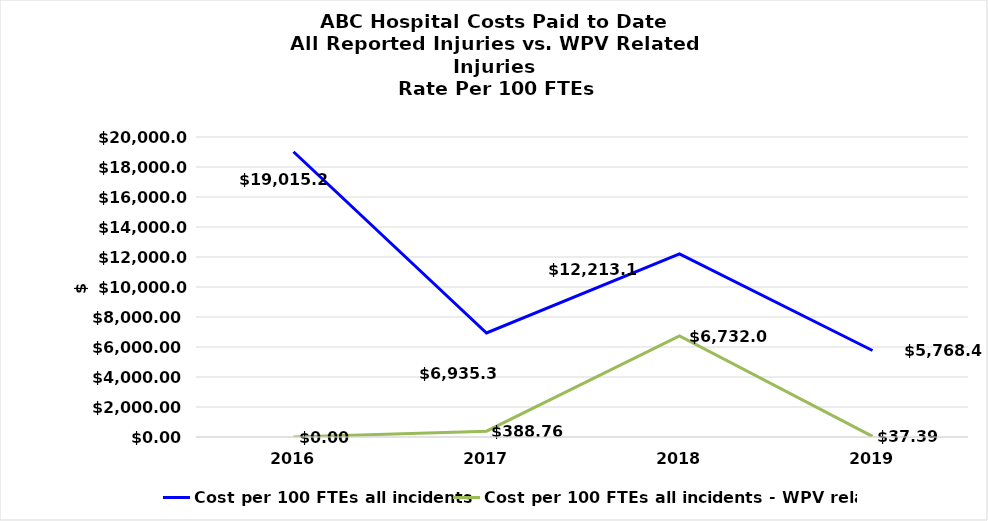
| Category | Cost per 100 FTEs all incidents | Cost per 100 FTEs all incidents - WPV related |
|---|---|---|
| 2016.0 | 19015.272 | 0 |
| 2017.0 | 6935.382 | 388.755 |
| 2018.0 | 12213.138 | 6731.996 |
| 2019.0 | 5768.462 | 37.387 |